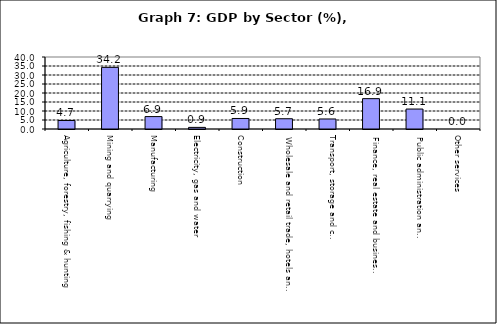
| Category | Series 0 |
|---|---|
| Agriculture, forestry, fishing & hunting | 4.725 |
| Mining and quarrying  | 34.238 |
| Manufacturing | 6.9 |
| Electricity, gas and water | 0.896 |
| Construction | 5.85 |
| Wholesale and retail trade, hotels and restaurants  | 5.702 |
| Transport, storage and communication                | 5.564 |
| Finance, real estate and business services          | 16.864 |
| Public administration and Defense                       | 11.089 |
| Other services                                    | 0 |